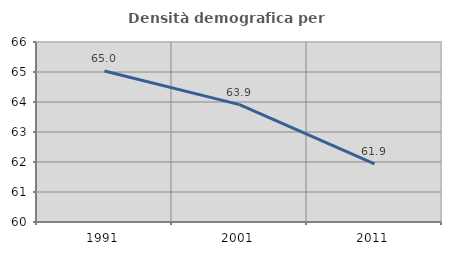
| Category | Densità demografica |
|---|---|
| 1991.0 | 65.034 |
| 2001.0 | 63.912 |
| 2011.0 | 61.94 |